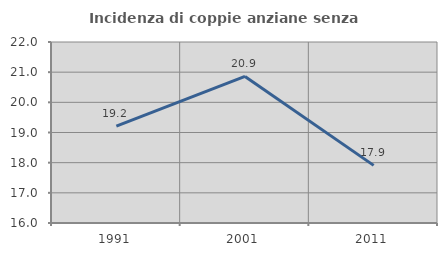
| Category | Incidenza di coppie anziane senza figli  |
|---|---|
| 1991.0 | 19.212 |
| 2001.0 | 20.859 |
| 2011.0 | 17.91 |